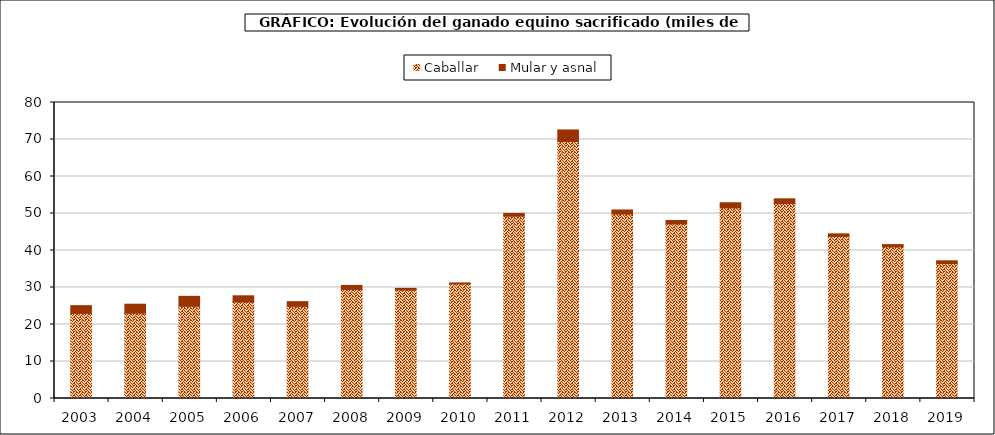
| Category | Caballar | Mular y asnal |
|---|---|---|
| 2003.0 | 23.011 | 2.082 |
| 2004.0 | 23.066 | 2.415 |
| 2005.0 | 24.929 | 2.681 |
| 2006.0 | 26.083 | 1.673 |
| 2007.0 | 24.904 | 1.267 |
| 2008.0 | 29.488 | 1.075 |
| 2009.0 | 29.317 | 0.44 |
| 2010.0 | 30.985 | 0.252 |
| 2011.0 | 49.28 | 0.744 |
| 2012.0 | 69.446 | 3.136 |
| 2013.0 | 49.841 | 1.113 |
| 2014.0 | 47.193 | 0.922 |
| 2015.0 | 51.517 | 1.391 |
| 2016.0 | 52.671 | 1.297 |
| 2017.0 | 43.813 | 0.688 |
| 2018.0 | 40.986 | 0.611 |
| 2019.0 | 36.484 | 0.727 |